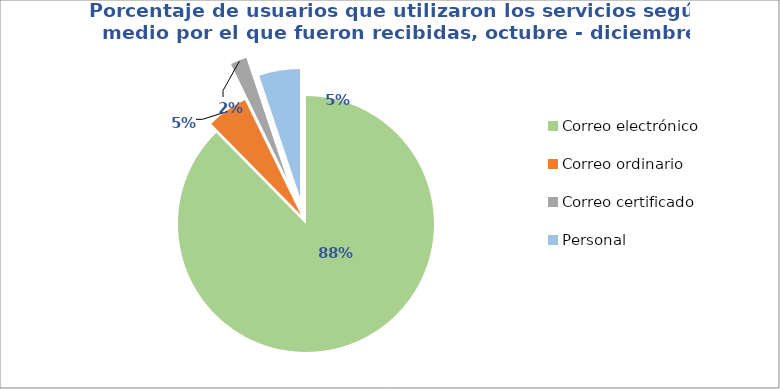
| Category | Series 0 |
|---|---|
| Correo electrónico | 85 |
| Correo ordinario | 5 |
| Correo certificado | 2 |
| Personal | 5 |